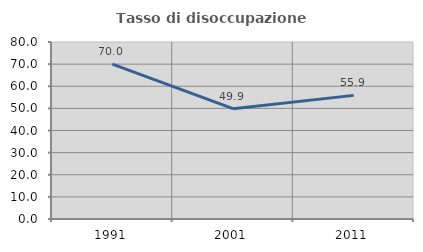
| Category | Tasso di disoccupazione giovanile  |
|---|---|
| 1991.0 | 70.013 |
| 2001.0 | 49.87 |
| 2011.0 | 55.877 |